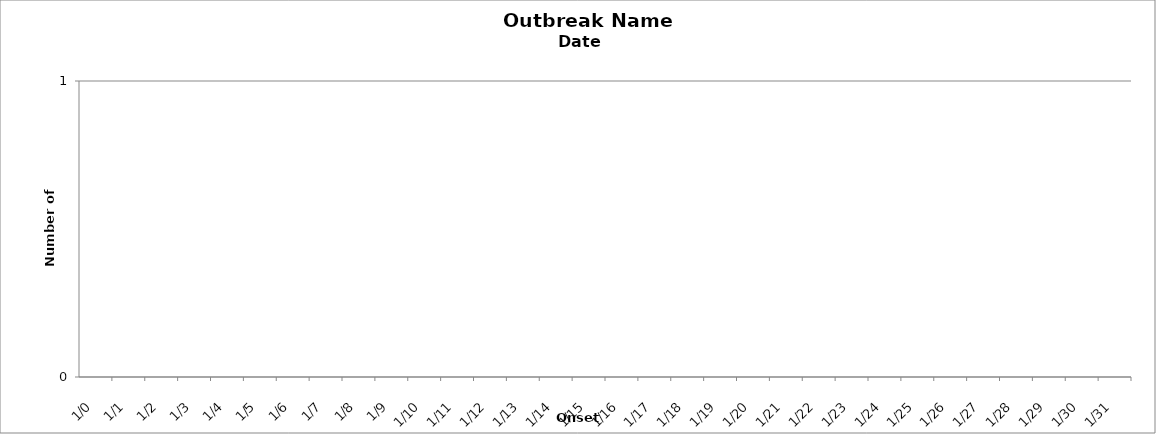
| Category | Staff (Suspected) | Staff (Lab Confirmed) | Residents (Suspected) | Residents (Lab Confirmed) |
|---|---|---|---|---|
| 0.0 | 0 | 0 | 0 | 0 |
| 1900-01-01 | 0 | 0 | 0 | 0 |
| 1900-01-02 | 0 | 0 | 0 | 0 |
| 1900-01-03 | 0 | 0 | 0 | 0 |
| 1900-01-04 | 0 | 0 | 0 | 0 |
| 1900-01-05 | 0 | 0 | 0 | 0 |
| 1900-01-06 | 0 | 0 | 0 | 0 |
| 1900-01-07 | 0 | 0 | 0 | 0 |
| 1900-01-08 | 0 | 0 | 0 | 0 |
| 1900-01-09 | 0 | 0 | 0 | 0 |
| 1900-01-10 | 0 | 0 | 0 | 0 |
| 1900-01-11 | 0 | 0 | 0 | 0 |
| 1900-01-12 | 0 | 0 | 0 | 0 |
| 1900-01-13 | 0 | 0 | 0 | 0 |
| 1900-01-14 | 0 | 0 | 0 | 0 |
| 1900-01-15 | 0 | 0 | 0 | 0 |
| 1900-01-16 | 0 | 0 | 0 | 0 |
| 1900-01-17 | 0 | 0 | 0 | 0 |
| 1900-01-18 | 0 | 0 | 0 | 0 |
| 1900-01-19 | 0 | 0 | 0 | 0 |
| 1900-01-20 | 0 | 0 | 0 | 0 |
| 1900-01-21 | 0 | 0 | 0 | 0 |
| 1900-01-22 | 0 | 0 | 0 | 0 |
| 1900-01-23 | 0 | 0 | 0 | 0 |
| 1900-01-24 | 0 | 0 | 0 | 0 |
| 1900-01-25 | 0 | 0 | 0 | 0 |
| 1900-01-26 | 0 | 0 | 0 | 0 |
| 1900-01-27 | 0 | 0 | 0 | 0 |
| 1900-01-28 | 0 | 0 | 0 | 0 |
| 1900-01-29 | 0 | 0 | 0 | 0 |
| 1900-01-30 | 0 | 0 | 0 | 0 |
| 1900-01-31 | 0 | 0 | 0 | 0 |